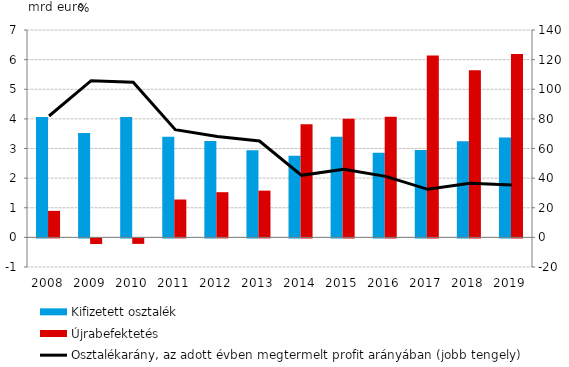
| Category | Kifizetett osztalék | Újrabefektetés |
|---|---|---|
| 2008.0 | 4.064 | 0.895 |
| 2009.0 | 3.522 | -0.192 |
| 2010.0 | 4.061 | -0.186 |
| 2011.0 | 3.399 | 1.278 |
| 2012.0 | 3.253 | 1.525 |
| 2013.0 | 2.94 | 1.578 |
| 2014.0 | 2.751 | 3.816 |
| 2015.0 | 3.396 | 4.002 |
| 2016.0 | 2.853 | 4.073 |
| 2017.0 | 2.946 | 6.137 |
| 2018.0 | 3.245 | 5.641 |
| 2019.0 | 3.375 | 6.189 |